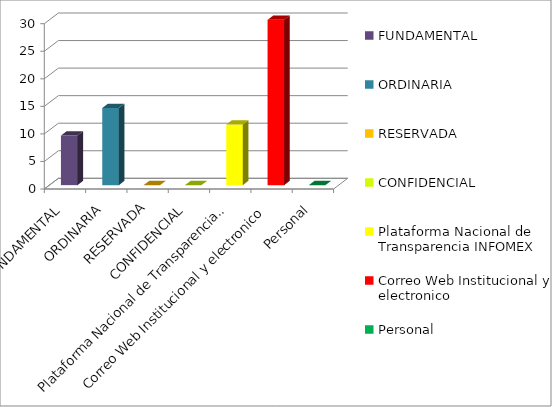
| Category | Series 2 |
|---|---|
| FUNDAMENTAL | 9 |
| ORDINARIA | 14 |
| RESERVADA | 0 |
| CONFIDENCIAL | 0 |
| Plataforma Nacional de Transparencia INFOMEX | 11 |
| Correo Web Institucional y electronico | 30 |
| Personal | 0 |